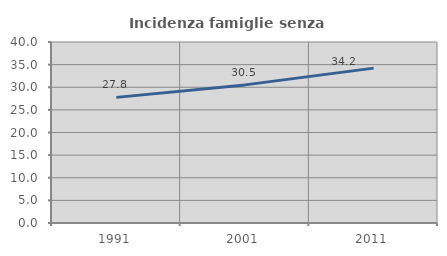
| Category | Incidenza famiglie senza nuclei |
|---|---|
| 1991.0 | 27.763 |
| 2001.0 | 30.523 |
| 2011.0 | 34.227 |